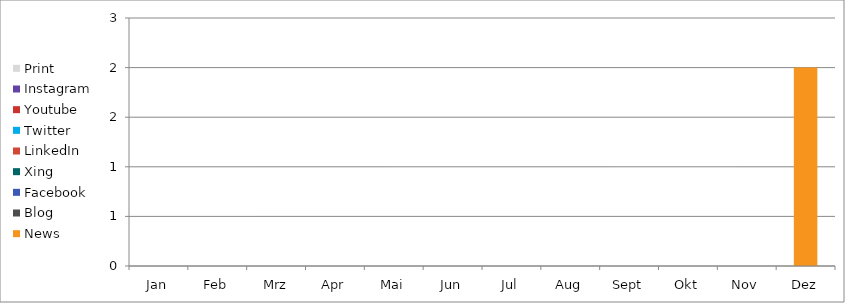
| Category | News | Blog | Facebook | Xing | LinkedIn | Twitter | Youtube | Instagram | Print |
|---|---|---|---|---|---|---|---|---|---|
| Jan | 0 | 0 | 0 | 0 | 0 | 0 | 0 | 0 | 0 |
| Feb | 0 | 0 | 0 | 0 | 0 | 0 | 0 | 0 | 0 |
| Mrz | 0 | 0 | 0 | 0 | 0 | 0 | 0 | 0 | 0 |
| Apr | 0 | 0 | 0 | 0 | 0 | 0 | 0 | 0 | 0 |
| Mai | 0 | 0 | 0 | 0 | 0 | 0 | 0 | 0 | 0 |
| Jun | 0 | 0 | 0 | 0 | 0 | 0 | 0 | 0 | 0 |
| Jul | 0 | 0 | 0 | 0 | 0 | 0 | 0 | 0 | 0 |
| Aug | 0 | 0 | 0 | 0 | 0 | 0 | 0 | 0 | 0 |
| Sept | 0 | 0 | 0 | 0 | 0 | 0 | 0 | 0 | 0 |
| Okt | 0 | 0 | 0 | 0 | 0 | 0 | 0 | 0 | 0 |
| Nov | 0 | 0 | 0 | 0 | 0 | 0 | 0 | 0 | 0 |
| Dez | 2 | 0 | 0 | 0 | 0 | 0 | 0 | 0 | 0 |